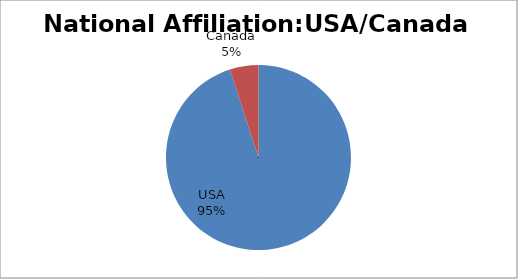
| Category | 57 3 |
|---|---|
| USA | 57 |
| Canada | 3 |